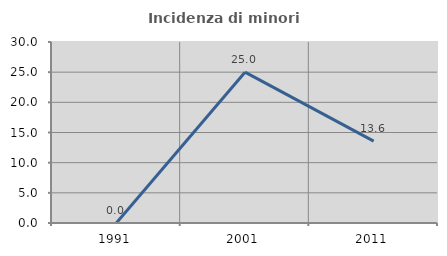
| Category | Incidenza di minori stranieri |
|---|---|
| 1991.0 | 0 |
| 2001.0 | 25 |
| 2011.0 | 13.559 |